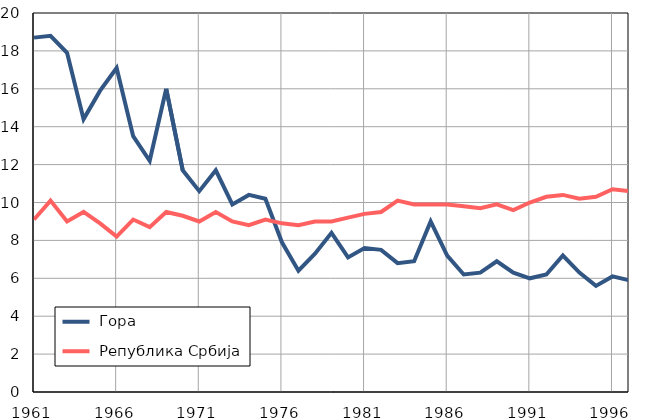
| Category |  Гора |  Република Србија |
|---|---|---|
| 1961.0 | 18.7 | 9.1 |
| 1962.0 | 18.8 | 10.1 |
| 1963.0 | 17.9 | 9 |
| 1964.0 | 14.4 | 9.5 |
| 1965.0 | 15.9 | 8.9 |
| 1966.0 | 17.1 | 8.2 |
| 1967.0 | 13.5 | 9.1 |
| 1968.0 | 12.2 | 8.7 |
| 1969.0 | 16 | 9.5 |
| 1970.0 | 11.7 | 9.3 |
| 1971.0 | 10.6 | 9 |
| 1972.0 | 11.7 | 9.5 |
| 1973.0 | 9.9 | 9 |
| 1974.0 | 10.4 | 8.8 |
| 1975.0 | 10.2 | 9.1 |
| 1976.0 | 7.9 | 8.9 |
| 1977.0 | 6.4 | 8.8 |
| 1978.0 | 7.3 | 9 |
| 1979.0 | 8.4 | 9 |
| 1980.0 | 7.1 | 9.2 |
| 1981.0 | 7.6 | 9.4 |
| 1982.0 | 7.5 | 9.5 |
| 1983.0 | 6.8 | 10.1 |
| 1984.0 | 6.9 | 9.9 |
| 1985.0 | 9 | 9.9 |
| 1986.0 | 7.2 | 9.9 |
| 1987.0 | 6.2 | 9.8 |
| 1988.0 | 6.3 | 9.7 |
| 1989.0 | 6.9 | 9.9 |
| 1990.0 | 6.3 | 9.6 |
| 1991.0 | 6 | 10 |
| 1992.0 | 6.2 | 10.3 |
| 1993.0 | 7.2 | 10.4 |
| 1994.0 | 6.3 | 10.2 |
| 1995.0 | 5.6 | 10.3 |
| 1996.0 | 6.1 | 10.7 |
| 1997.0 | 5.9 | 10.6 |